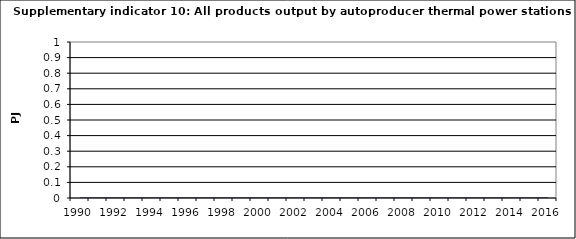
| Category | All products output by autoproducer thermal power stations, PJ |
|---|---|
| 1990 | 0 |
| 1991 | 0 |
| 1992 | 0 |
| 1993 | 0 |
| 1994 | 0 |
| 1995 | 0 |
| 1996 | 0 |
| 1997 | 0 |
| 1998 | 0 |
| 1999 | 0 |
| 2000 | 0 |
| 2001 | 0 |
| 2002 | 0 |
| 2003 | 0 |
| 2004 | 0 |
| 2005 | 0 |
| 2006 | 0 |
| 2007 | 0 |
| 2008 | 0 |
| 2009 | 0 |
| 2010 | 0 |
| 2011 | 0 |
| 2012 | 0 |
| 2013 | 0 |
| 2014 | 0 |
| 2015 | 0 |
| 2016 | 0 |